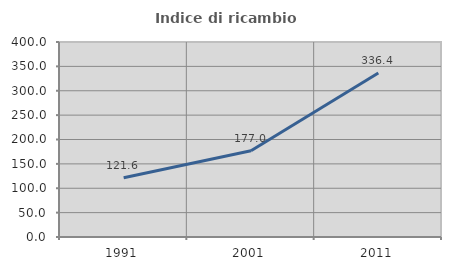
| Category | Indice di ricambio occupazionale  |
|---|---|
| 1991.0 | 121.557 |
| 2001.0 | 177 |
| 2011.0 | 336.364 |